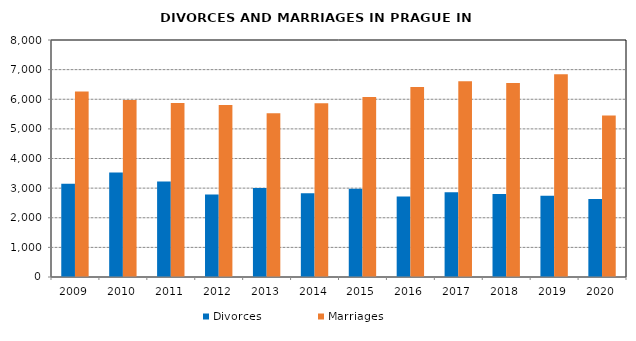
| Category | Divorces | Marriages |
|---|---|---|
| 2009.0 | 3150 | 6258 |
| 2010.0 | 3524 | 5978 |
| 2011.0 | 3220 | 5873 |
| 2012.0 | 2788 | 5807 |
| 2013.0 | 3002 | 5531 |
| 2014.0 | 2828 | 5862 |
| 2015.0 | 2983 | 6073 |
| 2016.0 | 2715 | 6415 |
| 2017.0 | 2860 | 6604 |
| 2018.0 | 2798 | 6549 |
| 2019.0 | 2743 | 6841 |
| 2020.0 | 2633 | 5455 |